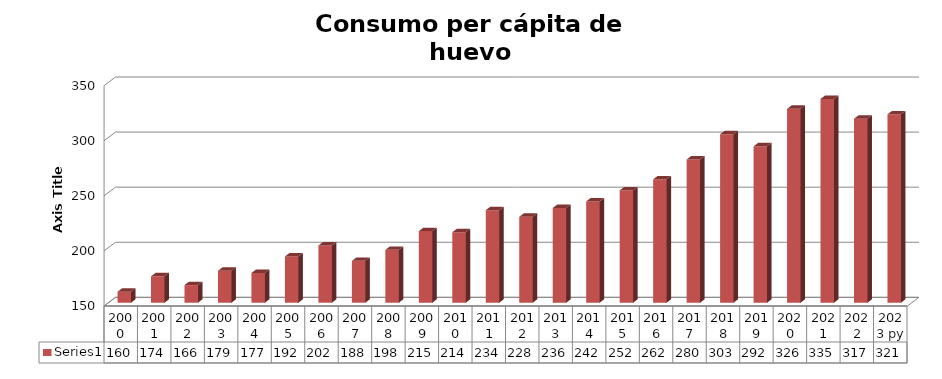
| Category | Series 0 |
|---|---|
| 2000 | 160 |
| 2001 | 174 |
| 2002 | 166 |
| 2003 | 179 |
| 2004 | 177 |
| 2005 | 192 |
| 2006 | 202 |
| 2007 | 188 |
| 2008 | 198 |
| 2009 | 215 |
| 2010 | 214 |
| 2011 | 234 |
| 2012 | 228 |
| 2013 | 236 |
| 2014 | 242 |
| 2015 | 252 |
| 2016 | 262 |
| 2017 | 280 |
| 2018 | 303 |
| 2019 | 292 |
| 2020 | 326 |
| 2021 | 335 |
| 2022 | 317 |
| 2023 py | 321 |